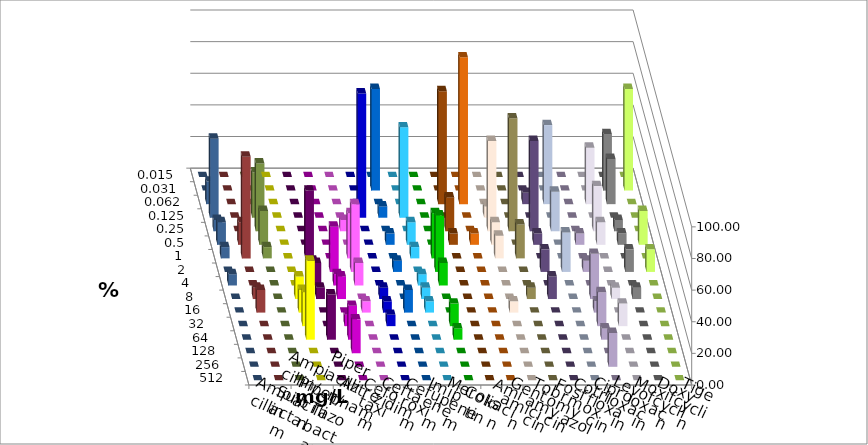
| Category | Ampicillin | Ampicillin/ Sulbactam | Piperacillin | Piperacillin/ Tazobactam | Aztreonam | Cefotaxim | Ceftazidim | Cefuroxim | Imipenem | Meropenem | Colistin | Amikacin | Gentamicin | Tobramycin | Fosfomycin | Cotrimoxazol | Ciprofloxacin | Levofloxacin | Moxifloxacin | Doxycyclin | Tigecyclin |
|---|---|---|---|---|---|---|---|---|---|---|---|---|---|---|---|---|---|---|---|---|---|
| 0.015 | 0 | 0 | 0 | 0 | 0 | 0 | 0 | 0 | 0 | 0 | 0 | 0 | 0 | 0 | 0 | 0 | 0 | 0 | 0 | 0 | 0 |
| 0.031 | 0 | 0 | 0 | 0 | 0 | 64.286 | 0 | 0 | 0 | 0 | 0 | 0 | 0 | 0 | 0 | 0 | 35.714 | 64.286 | 0 | 0 | 0 |
| 0.062 | 0 | 0 | 0 | 0 | 0 | 0 | 0 | 0 | 71.429 | 92.857 | 0 | 0 | 7.143 | 50 | 0 | 35.714 | 28.571 | 0 | 14.286 | 0 | 0 |
| 0.125 | 0 | 0 | 0 | 0 | 78.571 | 7.143 | 57.143 | 0 | 0 | 0 | 7.143 | 0 | 0 | 0 | 0 | 0 | 0 | 0 | 50 | 0 | 28.571 |
| 0.25 | 0 | 0 | 0 | 7.143 | 0 | 0 | 0 | 0 | 21.429 | 0 | 57.143 | 71.429 | 57.143 | 25 | 0 | 28.571 | 7.143 | 0 | 7.143 | 0 | 42.857 |
| 0.5 | 0 | 0 | 0 | 0 | 0 | 7.143 | 14.286 | 0 | 7.143 | 7.143 | 14.286 | 0 | 7.143 | 0 | 7.143 | 14.286 | 7.143 | 21.429 | 14.286 | 14.286 | 21.429 |
| 1.0 | 0 | 42.857 | 0 | 28.571 | 0 | 0 | 7.143 | 28.571 | 0 | 0 | 14.286 | 21.429 | 0 | 0 | 0 | 0 | 0 | 0 | 7.143 | 64.286 | 7.143 |
| 2.0 | 0 | 7.143 | 28.571 | 42.857 | 0 | 7.143 | 0 | 35.714 | 0 | 0 | 0 | 0 | 14.286 | 25 | 7.143 | 0 | 14.286 | 14.286 | 0 | 0 | 0 |
| 4.0 | 0 | 14.286 | 7.143 | 14.286 | 0 | 0 | 7.143 | 14.286 | 0 | 0 | 0 | 0 | 0 | 0 | 0 | 0 | 0 | 0 | 7.143 | 0 | 0 |
| 8.0 | 14.286 | 7.143 | 14.286 | 0 | 7.143 | 0 | 7.143 | 0 | 0 | 0 | 0 | 7.143 | 14.286 | 0 | 28.571 | 7.143 | 7.143 | 0 | 0 | 7.143 | 0 |
| 16.0 | 14.286 | 0 | 0 | 7.143 | 7.143 | 14.286 | 7.143 | 0 | 0 | 0 | 7.143 | 0 | 0 | 0 | 7.143 | 0 | 0 | 0 | 0 | 14.286 | 0 |
| 32.0 | 21.429 | 0 | 7.143 | 0 | 7.143 | 0 | 0 | 14.286 | 0 | 0 | 0 | 0 | 0 | 0 | 21.429 | 14.286 | 0 | 0 | 0 | 0 | 0 |
| 64.0 | 50 | 28.571 | 21.429 | 0 | 0 | 0 | 0 | 7.143 | 0 | 0 | 0 | 0 | 0 | 0 | 7.143 | 0 | 0 | 0 | 0 | 0 | 0 |
| 128.0 | 0 | 0 | 21.429 | 0 | 0 | 0 | 0 | 0 | 0 | 0 | 0 | 0 | 0 | 0 | 0 | 0 | 0 | 0 | 0 | 0 | 0 |
| 256.0 | 0 | 0 | 0 | 0 | 0 | 0 | 0 | 0 | 0 | 0 | 0 | 0 | 0 | 0 | 21.429 | 0 | 0 | 0 | 0 | 0 | 0 |
| 512.0 | 0 | 0 | 0 | 0 | 0 | 0 | 0 | 0 | 0 | 0 | 0 | 0 | 0 | 0 | 0 | 0 | 0 | 0 | 0 | 0 | 0 |